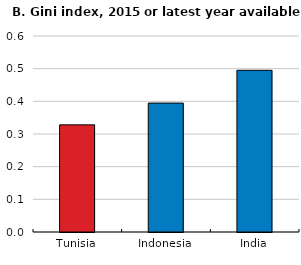
| Category | Series 0 |
|---|---|
| Tunisia | 0.328 |
| Indonesia | 0.395 |
| India | 0.495 |